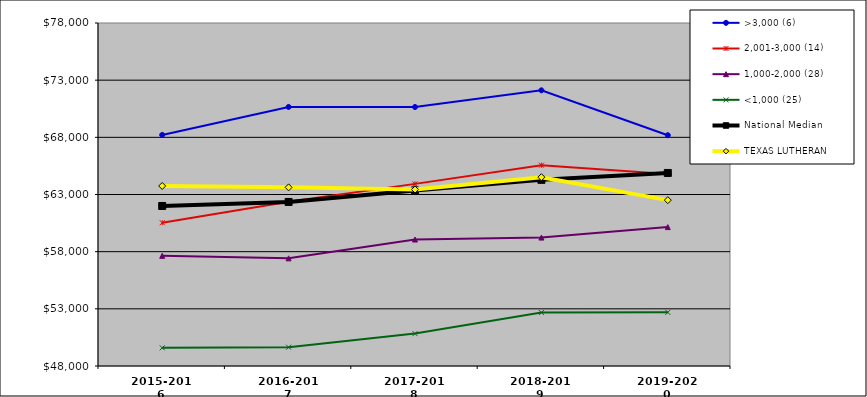
| Category | >3,000 (6) | 2,001-3,000 (14) | 1,000-2,000 (28) | <1,000 (25) | National Median | TEXAS LUTHERAN |
|---|---|---|---|---|---|---|
| 2015-2016 | 68211 | 60529.5 | 57636 | 49590 | 61996.5 | 63747 |
| 2016-2017 | 70658.5 | 62360.5 | 57415.5 | 49644 | 62349 | 63624 |
| 2017-2018 | 70651.5 | 63930 | 59060.5 | 50833 | 63357 | 63432 |
| 2018-2019 | 72112.5 | 65561.5 | 59231 | 52675 | 64282.5 | 64514 |
| 2019-2020 | 68185.5 | 64787.5 | 60147.5 | 52693 | 64884.5 | 62508 |